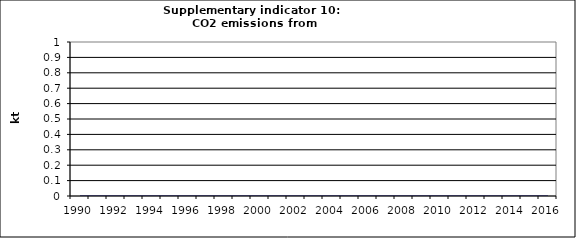
| Category | CO2 emissions from autoproducers, kt |
|---|---|
| 1990 | 0 |
| 1991 | 0 |
| 1992 | 0 |
| 1993 | 0 |
| 1994 | 0 |
| 1995 | 0 |
| 1996 | 0 |
| 1997 | 0 |
| 1998 | 0 |
| 1999 | 0 |
| 2000 | 0 |
| 2001 | 0 |
| 2002 | 0 |
| 2003 | 0 |
| 2004 | 0 |
| 2005 | 0 |
| 2006 | 0 |
| 2007 | 0 |
| 2008 | 0 |
| 2009 | 0 |
| 2010 | 0 |
| 2011 | 0 |
| 2012 | 0 |
| 2013 | 0 |
| 2014 | 0 |
| 2015 | 0 |
| 2016 | 0 |